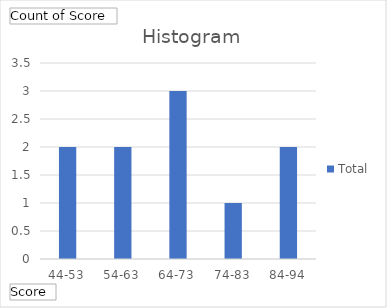
| Category | Total |
|---|---|
| 44-53 | 2 |
| 54-63 | 2 |
| 64-73 | 3 |
| 74-83 | 1 |
| 84-94 | 2 |